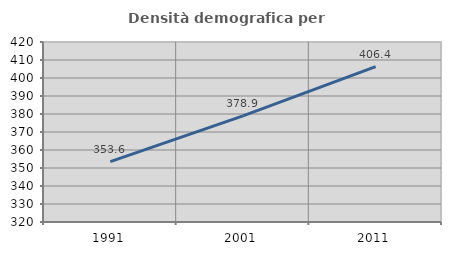
| Category | Densità demografica |
|---|---|
| 1991.0 | 353.551 |
| 2001.0 | 378.948 |
| 2011.0 | 406.361 |